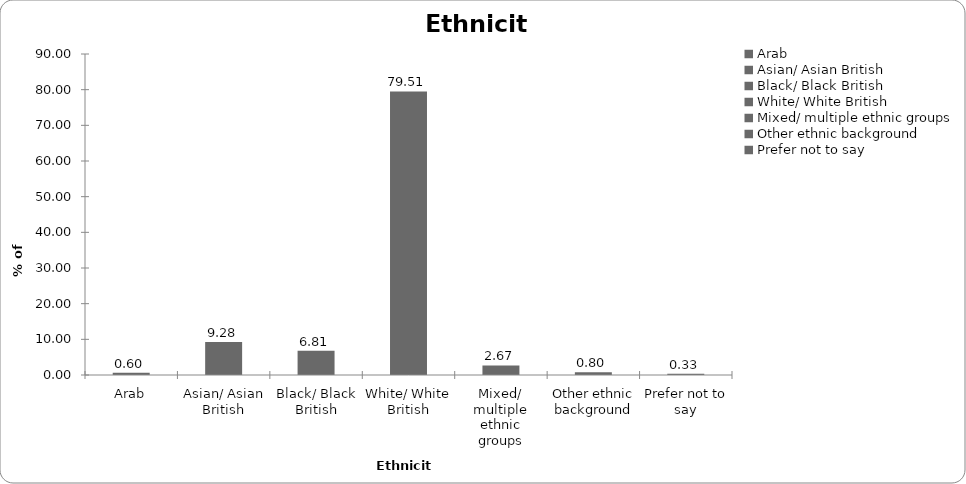
| Category | Ethnicity |
|---|---|
| Arab | 0.601 |
| Asian/ Asian British | 9.279 |
| Black/ Black British | 6.809 |
| White/ White British | 79.506 |
| Mixed/ multiple ethnic groups | 2.67 |
| Other ethnic background | 0.801 |
| Prefer not to say | 0.334 |